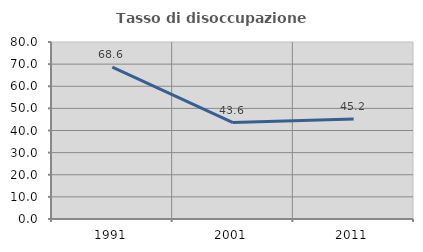
| Category | Tasso di disoccupazione giovanile  |
|---|---|
| 1991.0 | 68.605 |
| 2001.0 | 43.59 |
| 2011.0 | 45.161 |